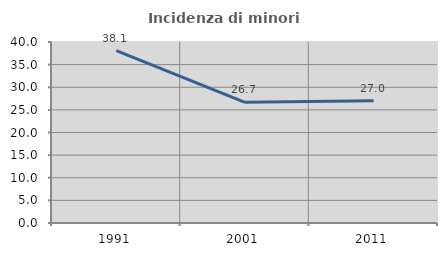
| Category | Incidenza di minori stranieri |
|---|---|
| 1991.0 | 38.095 |
| 2001.0 | 26.667 |
| 2011.0 | 26.996 |